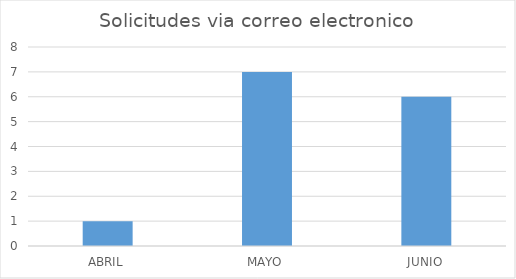
| Category | Series 0 |
|---|---|
| ABRIL | 1 |
| MAYO | 7 |
| JUNIO | 6 |